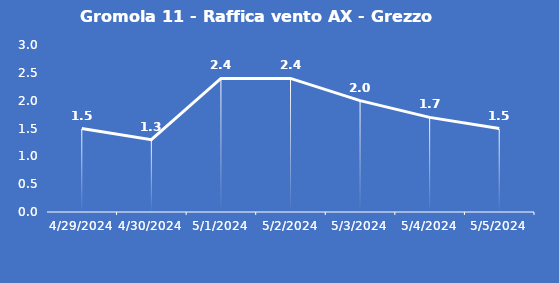
| Category | Gromola 11 - Raffica vento AX - Grezzo (m/s) |
|---|---|
| 4/29/24 | 1.5 |
| 4/30/24 | 1.3 |
| 5/1/24 | 2.4 |
| 5/2/24 | 2.4 |
| 5/3/24 | 2 |
| 5/4/24 | 1.7 |
| 5/5/24 | 1.5 |